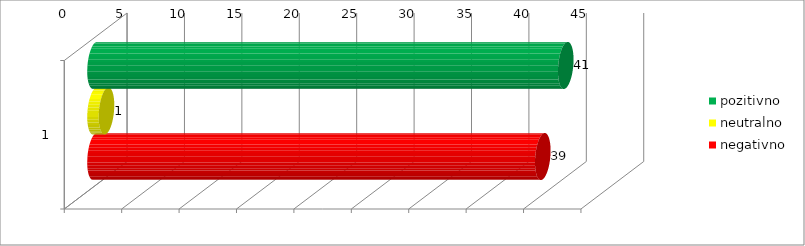
| Category | pozitivno | neutralno | negativno |
|---|---|---|---|
| 0 | 41 | 1 | 39 |